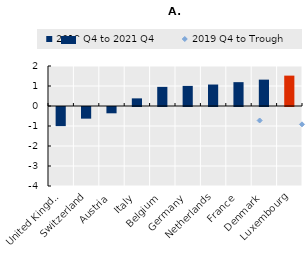
| Category | 2019 Q4 to 2021 Q4 |
|---|---|
| United Kingdom | -0.956 |
| Switzerland | -0.582 |
| Austria | -0.315 |
| Italy | 0.382 |
| Belgium | 0.956 |
| Germany | 1.005 |
| Netherlands | 1.074 |
| France | 1.192 |
| Denmark | 1.318 |
| Luxembourg | 1.519 |